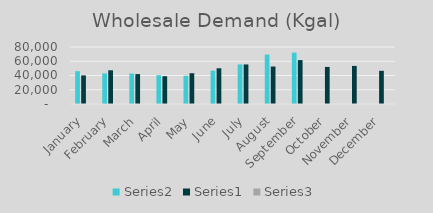
| Category | Series 1 | Series 0 | Series 2 |
|---|---|---|---|
| January | 46042 | 40140 | 1.147 |
| February | 42951.714 | 47315 | 0.908 |
| March | 42828.697 | 41977 | 1.02 |
| April | 40411.734 | 38996.46 | 1.036 |
| May | 39719.105 | 43187.656 | 0.92 |
| June | 46763.685 | 50131.03 | 0.933 |
| July | 55518.584 | 55518.584 | 1 |
| August | 69421.963 | 52591.348 | 1.32 |
| September | 72151.764 | 61625.007 | 1.171 |
| October | 0 | 52042.125 | 0 |
| November | 0 | 53432.969 | 0 |
| December | 0 | 46567.149 | 0 |